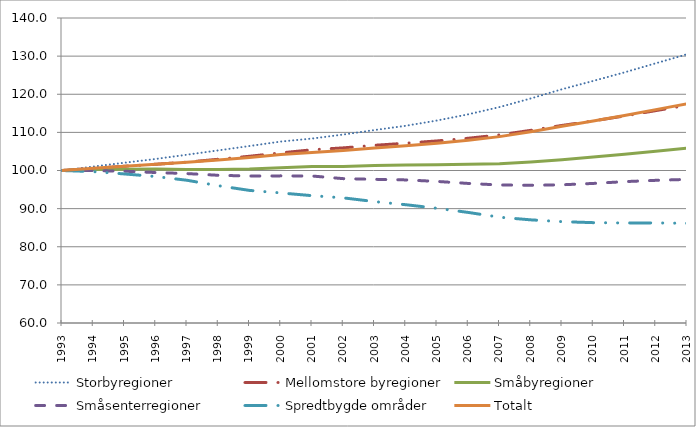
| Category | Storbyregioner | Mellomstore byregioner | Småbyregioner | Småsenterregioner | Spredtbygde områder | Totalt |
|---|---|---|---|---|---|---|
| 1993.0 | 100 | 100 | 100 | 100 | 100 | 100 |
| 1994.0 | 101.02 | 100.543 | 100.247 | 99.973 | 99.712 | 100.597 |
| 1995.0 | 102.037 | 101.113 | 100.317 | 99.817 | 99.095 | 101.145 |
| 1996.0 | 103.03 | 101.636 | 100.372 | 99.464 | 98.42 | 101.647 |
| 1997.0 | 104.142 | 102.194 | 100.27 | 99.194 | 97.438 | 102.176 |
| 1998.0 | 105.275 | 102.947 | 100.267 | 98.742 | 96.012 | 102.755 |
| 1999.0 | 106.421 | 103.735 | 100.367 | 98.553 | 94.78 | 103.4 |
| 2000.0 | 107.59 | 104.613 | 100.75 | 98.59 | 94.116 | 104.171 |
| 2001.0 | 108.376 | 105.431 | 101.065 | 98.555 | 93.399 | 104.751 |
| 2002.0 | 109.429 | 105.936 | 101.061 | 97.865 | 92.825 | 105.231 |
| 2003.0 | 110.609 | 106.609 | 101.289 | 97.685 | 91.847 | 105.887 |
| 2004.0 | 111.725 | 107.153 | 101.432 | 97.532 | 91.028 | 106.473 |
| 2005.0 | 113.11 | 107.759 | 101.51 | 97.136 | 90.088 | 107.145 |
| 2006.0 | 114.739 | 108.459 | 101.643 | 96.606 | 89.003 | 107.933 |
| 2007.0 | 116.636 | 109.336 | 101.763 | 96.202 | 87.746 | 108.885 |
| 2008.0 | 118.896 | 110.532 | 102.238 | 96.12 | 87.057 | 110.188 |
| 2009.0 | 121.315 | 111.823 | 102.829 | 96.252 | 86.583 | 111.632 |
| 2010.0 | 123.494 | 113.007 | 103.57 | 96.607 | 86.322 | 113.003 |
| 2011.0 | 125.74 | 114.304 | 104.281 | 97.078 | 86.24 | 114.448 |
| 2012.0 | 128.122 | 115.706 | 105.021 | 97.418 | 86.255 | 115.973 |
| 2013.0 | 130.488 | 117.103 | 105.861 | 97.67 | 86.148 | 117.494 |